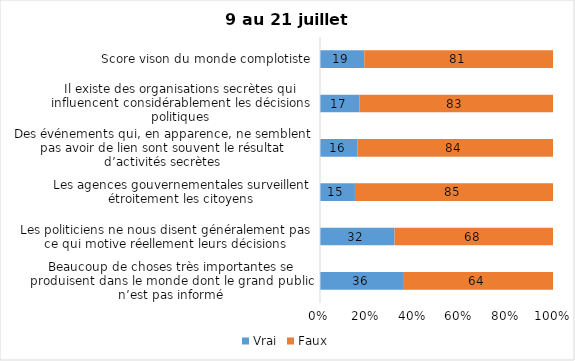
| Category | Vrai | Faux |
|---|---|---|
| Beaucoup de choses très importantes se produisent dans le monde dont le grand public n’est pas informé | 36 | 64 |
| Les politiciens ne nous disent généralement pas ce qui motive réellement leurs décisions | 32 | 68 |
| Les agences gouvernementales surveillent étroitement les citoyens | 15 | 85 |
| Des événements qui, en apparence, ne semblent pas avoir de lien sont souvent le résultat d’activités secrètes | 16 | 84 |
| Il existe des organisations secrètes qui influencent considérablement les décisions politiques | 17 | 83 |
| Score vison du monde complotiste | 19 | 81 |